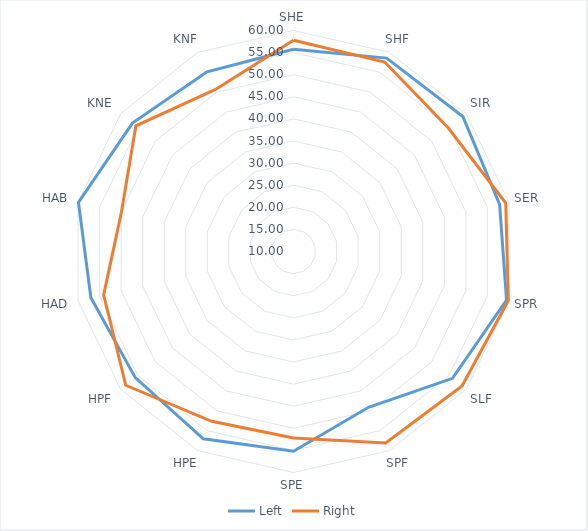
| Category | Left | Right |
|---|---|---|
| SHE | 55.76 | 57.81 |
| SHF | 58.57 | 57.57 |
| SIR | 59 | 54.81 |
| SER | 57.83 | 59.26 |
| SPR | 59.44 | 59.85 |
| SLF | 56.01 | 58.78 |
| SPF | 49.12 | 58.09 |
| SPE | 55.19 | 52.17 |
| HPE | 57.04 | 52.63 |
| HPF | 55.78 | 58.54 |
| HAD | 57.02 | 54.05 |
| HAB | 59.9 | 49.93 |
| KNE | 56.6 | 55.61 |
| KNF | 55.11 | 50.69 |